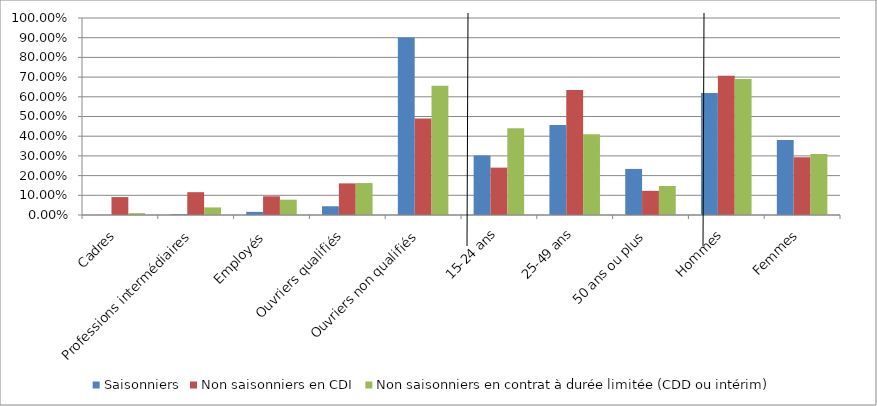
| Category | Saisonniers | Non saisonniers en CDI | Non saisonniers en contrat à durée limitée (CDD ou intérim) |
|---|---|---|---|
| Cadres | 0.001 | 0.091 | 0.009 |
| Professions intermédiaires | 0.004 | 0.116 | 0.039 |
| Employés  | 0.016 | 0.095 | 0.078 |
| Ouvriers qualifiés | 0.044 | 0.161 | 0.162 |
| Ouvriers non qualifiés | 0.902 | 0.49 | 0.656 |
| 15-24 ans | 0.302 | 0.24 | 0.441 |
| 25-49 ans | 0.456 | 0.634 | 0.41 |
| 50 ans ou plus | 0.234 | 0.123 | 0.147 |
| Hommes | 0.62 | 0.707 | 0.691 |
| Femmes | 0.38 | 0.293 | 0.309 |